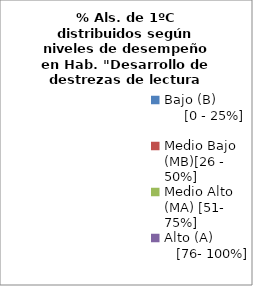
| Category | Series 0 |
|---|---|
| Bajo (B)              [0 - 25%] | 0 |
| Medio Bajo (MB)[26 - 50%] | 0 |
| Medio Alto (MA) [51- 75%] | 0 |
| Alto (A)             [76- 100%] | 0 |